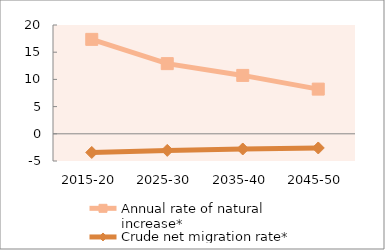
| Category | Annual rate of natural increase* | Crude net migration rate* |
|---|---|---|
| 2015-20 | 17.358 | -3.432 |
| 2025-30 | 12.898 | -3.049 |
| 2035-40 | 10.734 | -2.793 |
| 2045-50 | 8.214 | -2.607 |